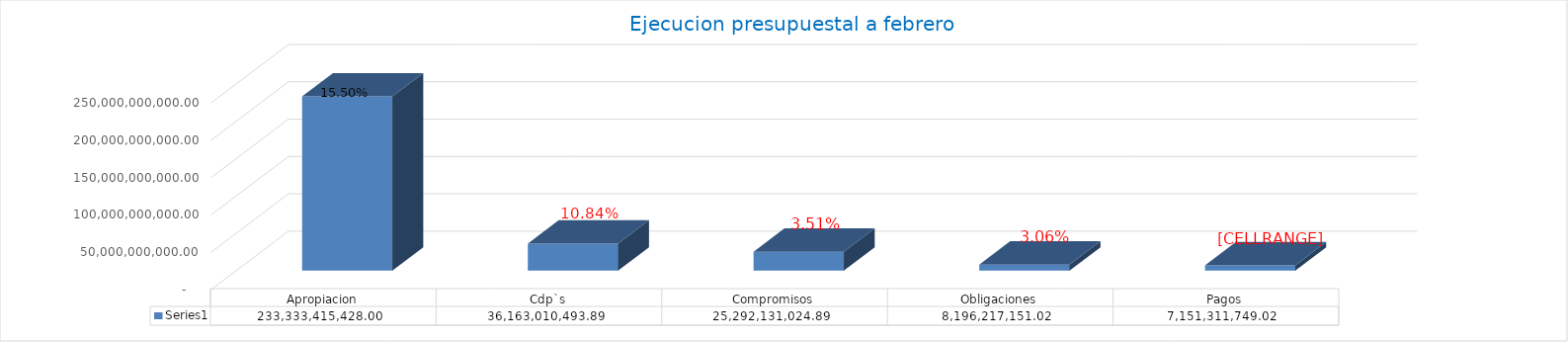
| Category | Series 0 |
|---|---|
| Apropiacion | 233333415428 |
| Cdp`s | 36163010493.89 |
| Compromisos | 25292131024.89 |
| Obligaciones | 8196217151.02 |
| Pagos | 7151311749.02 |